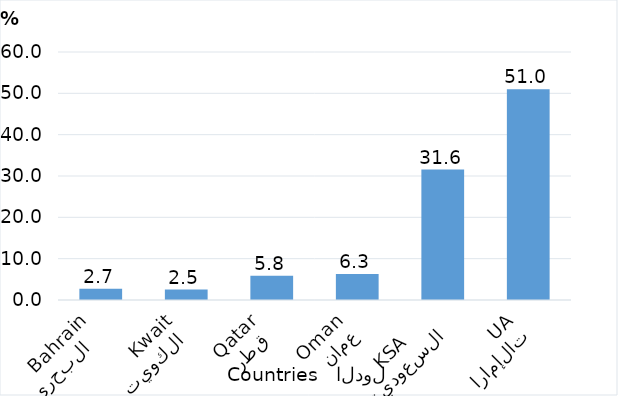
| Category | Series 0 |
|---|---|
| الإمارات
UAE | 51.018 |
| السعودية
KSA      | 31.564 |
| عمان
 Oman | 6.32 |
| قطر 
 Qatar | 5.847 |
| الكويت 
    Kwait | 2.537 |
| البحرين   
 Bahrain | 2.715 |